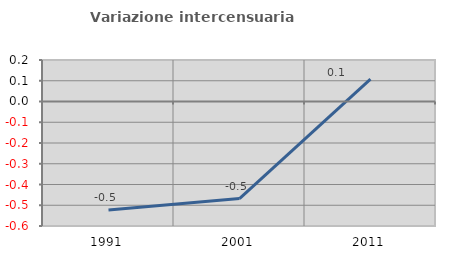
| Category | Variazione intercensuaria annua |
|---|---|
| 1991.0 | -0.523 |
| 2001.0 | -0.468 |
| 2011.0 | 0.108 |